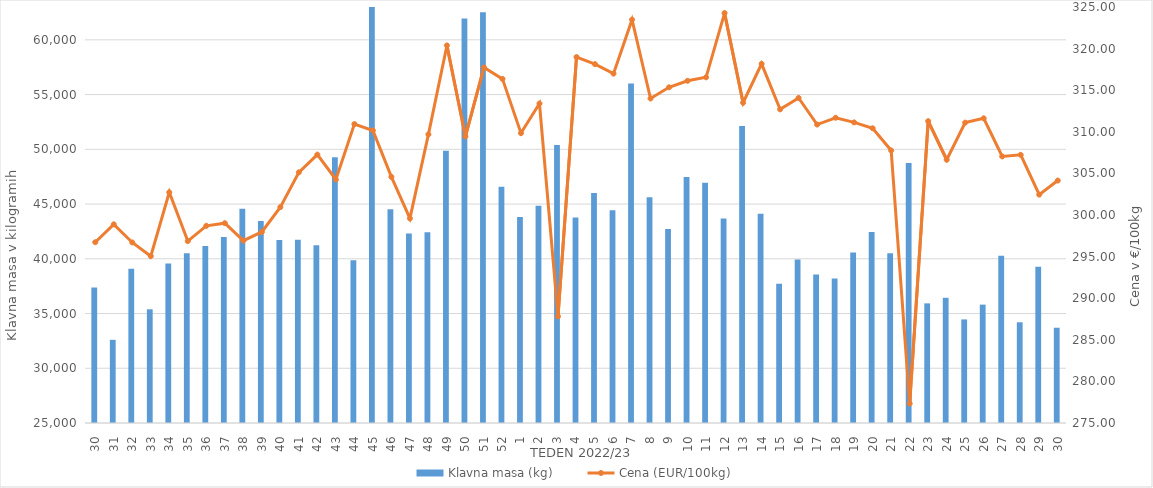
| Category | Klavna masa (kg) |
|---|---|
| 30.0 | 37366 |
| 31.0 | 32599 |
| 32.0 | 39100 |
| 33.0 | 35388 |
| 34.0 | 39563 |
| 35.0 | 40507 |
| 36.0 | 41176 |
| 37.0 | 41983 |
| 38.0 | 44572 |
| 39.0 | 43447 |
| 40.0 | 41711 |
| 41.0 | 41736 |
| 42.0 | 41239 |
| 43.0 | 49284 |
| 44.0 | 39877 |
| 45.0 | 63668 |
| 46.0 | 44528 |
| 47.0 | 42319 |
| 48.0 | 42416 |
| 49.0 | 49873 |
| 50.0 | 61942 |
| 51.0 | 62514 |
| 52.0 | 46589 |
| 1.0 | 43807 |
| 2.0 | 44834 |
| 3.0 | 50386 |
| 4.0 | 43773 |
| 5.0 | 46011 |
| 6.0 | 44439 |
| 7.0 | 56001 |
| 8.0 | 45613 |
| 9.0 | 42730 |
| 10.0 | 47471 |
| 11.0 | 46952 |
| 12.0 | 43683 |
| 13.0 | 52135 |
| 14.0 | 44103 |
| 15.0 | 37719 |
| 16.0 | 39943 |
| 17.0 | 38574 |
| 18.0 | 38200 |
| 19.0 | 40581 |
| 20.0 | 42443 |
| 21.0 | 40517 |
| 22.0 | 48742 |
| 23.0 | 35927 |
| 24.0 | 36436 |
| 25.0 | 34463 |
| 26.0 | 35812 |
| 27.0 | 40280 |
| 28.0 | 34201 |
| 29.0 | 39279 |
| 30.0 | 33702 |